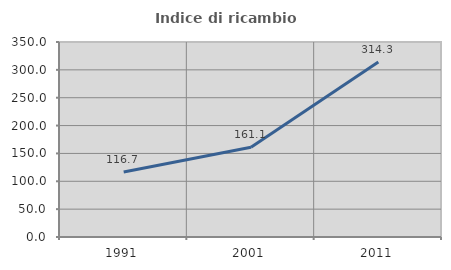
| Category | Indice di ricambio occupazionale  |
|---|---|
| 1991.0 | 116.667 |
| 2001.0 | 161.111 |
| 2011.0 | 314.286 |